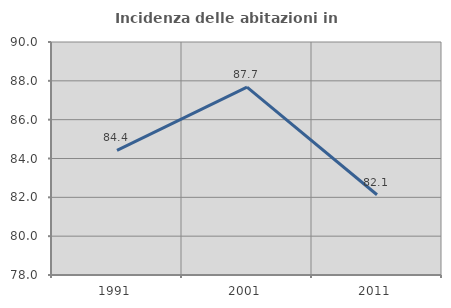
| Category | Incidenza delle abitazioni in proprietà  |
|---|---|
| 1991.0 | 84.416 |
| 2001.0 | 87.671 |
| 2011.0 | 82.133 |